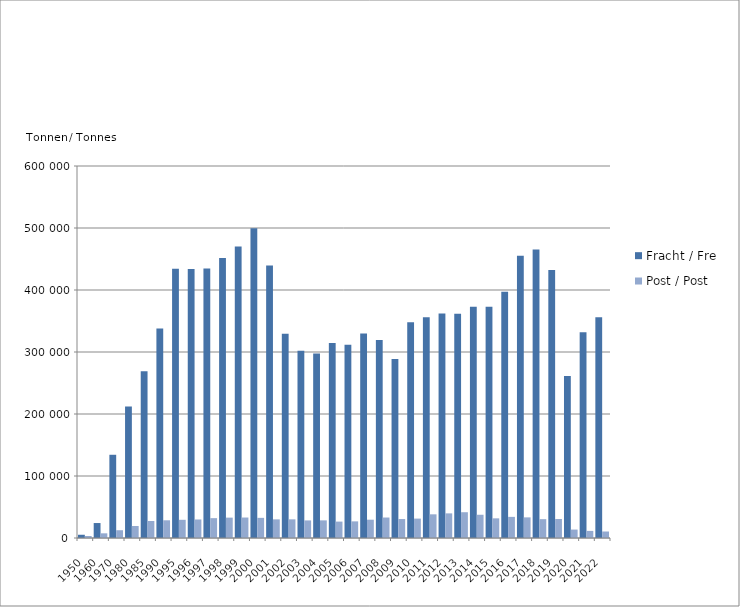
| Category | Fracht / Fret | Post / Post |
|---|---|---|
| 1950.0 | 5237 | 3202 |
| 1960.0 | 24133 | 7534 |
| 1970.0 | 134234 | 12539 |
| 1980.0 | 211921 | 19326 |
| 1985.0 | 268957 | 27445 |
| 1990.0 | 337907 | 28567 |
| 1995.0 | 434432 | 29345 |
| 1996.0 | 433814 | 29878 |
| 1997.0 | 434646 | 32029 |
| 1998.0 | 451429 | 32849 |
| 1999.0 | 470069 | 33030 |
| 2000.0 | 499552 | 32493 |
| 2001.0 | 439710 | 30052 |
| 2002.0 | 329396 | 30094 |
| 2003.0 | 301988 | 28358 |
| 2004.0 | 297582 | 28446 |
| 2005.0 | 314334 | 26458 |
| 2006.0 | 311760 | 26828 |
| 2007.0 | 330023 | 29518 |
| 2008.0 | 319530 | 33029 |
| 2009.0 | 288855 | 30594 |
| 2010.0 | 348091 | 31298 |
| 2011.0 | 356231 | 38192 |
| 2012.0 | 362151 | 39719 |
| 2013.0 | 361681 | 41569 |
| 2014.0 | 373144 | 37489 |
| 2015.0 | 372924 | 31708 |
| 2016.0 | 397064 | 34077 |
| 2017.0 | 455345 | 33269 |
| 2018.0 | 465363 | 30387 |
| 2019.0 | 432144 | 30645 |
| 2020.0 | 261103 | 13597 |
| 2021.0 | 331976 | 11437 |
| 2022.0 | 355899 | 10485 |